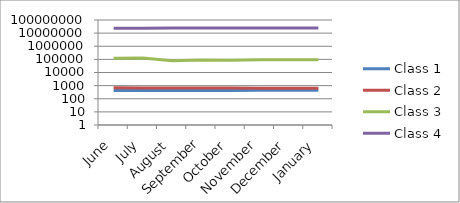
| Category | Class 1 | Class 2 | Class 3 | Class 4 |
|---|---|---|---|---|
| June | 422 | 687 | 123483 | 24005430 |
| July | 427 | 658 | 125491 | 24038014 |
| August | 427 | 655 | 78827 | 24101362 |
| September | 429 | 650 | 88860 | 24110132 |
| October | 433 | 645 | 87615 | 24128941 |
| November | 437 | 636 | 95286 | 24146202 |
| December | 438 | 639 | 95544 | 24160382 |
| January | 441 | 638 | 95568 | 24173580 |